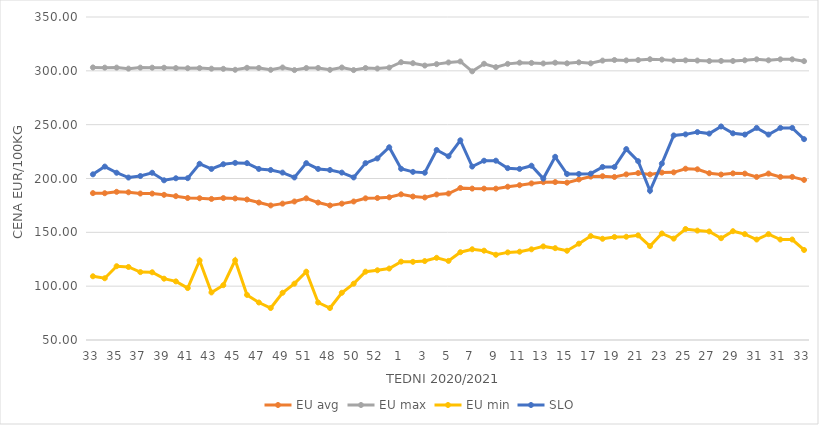
| Category | EU avg | EU max | EU min | SLO |
|---|---|---|---|---|
| 33.0 | 186.411 | 303.17 | 109.191 | 203.88 |
| 34.0 | 186.338 | 302.96 | 107.355 | 211.07 |
| 35.0 | 187.628 | 302.99 | 118.534 | 205.34 |
| 36.0 | 187.19 | 302.05 | 117.814 | 200.88 |
| 37.0 | 186.038 | 302.98 | 113.058 | 202.29 |
| 38.0 | 185.986 | 302.94 | 112.896 | 205.33 |
| 39.0 | 184.836 | 302.88 | 106.953 | 198.33 |
| 40.0 | 183.595 | 302.56 | 104.426 | 200.21 |
| 41.0 | 181.893 | 302.44 | 98.23 | 200.3 |
| 42.0 | 181.671 | 302.52 | 123.908 | 213.66 |
| 43.0 | 181.023 | 302.01 | 94.177 | 208.86 |
| 44.0 | 181.795 | 301.86 | 100.908 | 213.25 |
| 45.0 | 181.489 | 300.98 | 124 | 214.51 |
| 46.0 | 180.473 | 302.82 | 91.889 | 214.27 |
| 47.0 | 177.656 | 302.7 | 84.832 | 208.87 |
| 48.0 | 174.977 | 300.94 | 79.697 | 207.9 |
| 49.0 | 176.65 | 303.09 | 93.873 | 205.48 |
| 50.0 | 178.648 | 300.7 | 102.316 | 200.99 |
| 51.0 | 181.58 | 302.62 | 113.46 | 214.25 |
| 47.0 | 177.656 | 302.7 | 84.832 | 208.87 |
| 48.0 | 174.977 | 300.94 | 79.697 | 207.9 |
| 49.0 | 176.65 | 303.09 | 93.873 | 205.48 |
| 50.0 | 178.648 | 300.7 | 102.316 | 200.99 |
| 51.0 | 181.58 | 302.62 | 113.46 | 214.25 |
| 52.0 | 181.9 | 302.14 | 114.76 | 218.61 |
| 53.0 | 182.536 | 303 | 116.375 | 229 |
| 1.0 | 185.3 | 308 | 122.769 | 209 |
| 2.0 | 183.25 | 307.1 | 122.609 | 206.15 |
| 3.0 | 182.393 | 304.91 | 123.32 | 205.35 |
| 4.0 | 185.158 | 306.22 | 126.329 | 226.48 |
| 5.0 | 186.04 | 307.79 | 123.461 | 220.65 |
| 6.0 | 191.206 | 308.7 | 131.528 | 235.46 |
| 7.0 | 190.629 | 299.55 | 134.262 | 211.1 |
| 8.0 | 190.57 | 306.55 | 132.97 | 216.51 |
| 9.0 | 190.562 | 303.4 | 129.173 | 216.54 |
| 10.0 | 192.373 | 306.48 | 131.374 | 209.61 |
| 11.0 | 193.79 | 307.58 | 132.024 | 208.91 |
| 12.0 | 195.449 | 307.33 | 134.212 | 211.87 |
| 13.0 | 196.631 | 306.85 | 136.936 | 199.93 |
| 14.0 | 196.702 | 307.56 | 135.297 | 220.15 |
| 15.0 | 196.13 | 306.96 | 132.893 | 204.2 |
| 16.0 | 199.1 | 307.87 | 139.462 | 204.2 |
| 17.0 | 201.754 | 306.98 | 146.538 | 204.51 |
| 18.0 | 202.13 | 309.49 | 144.017 | 210.72 |
| 19.0 | 201.439 | 310.06 | 145.644 | 210.68 |
| 20.0 | 203.834 | 309.69 | 145.911 | 227.32 |
| 21.0 | 205.04 | 309.99 | 147.188 | 216.08 |
| 22.0 | 203.79 | 310.76 | 137.177 | 188.6 |
| 23.0 | 205.51 | 310.41 | 148.928 | 213.84 |
| 24.0 | 205.73 | 309.64 | 144.161 | 239.99 |
| 25.0 | 209.095 | 309.74 | 153.081 | 240.99 |
| 26.0 | 208.551 | 309.55 | 151.599 | 243.11 |
| 27.0 | 204.914 | 309.08 | 150.789 | 241.72 |
| 28.0 | 203.681 | 309.21 | 144.56 | 248.33 |
| 29.0 | 204.773 | 309.15 | 151.052 | 241.96 |
| 30.0 | 204.558 | 309.78 | 148.33 | 240.79 |
| 31.0 | 201.483 | 310.67 | 143.33 | 247 |
| 30.0 | 204.558 | 309.78 | 148.33 | 240.79 |
| 31.0 | 201.483 | 310.67 | 143.33 | 247 |
| 32.0 | 201.483 | 310.67 | 143.33 | 247 |
| 33.0 | 198.691 | 309 | 133.607 | 236.54 |